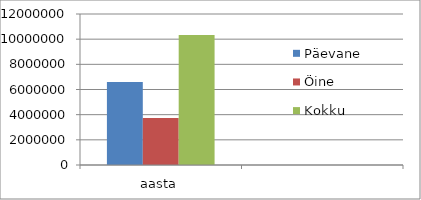
| Category | Päevane | Öine | Kokku |
|---|---|---|---|
| aasta | 6604607.4 | 3727256 | 10331863.4 |